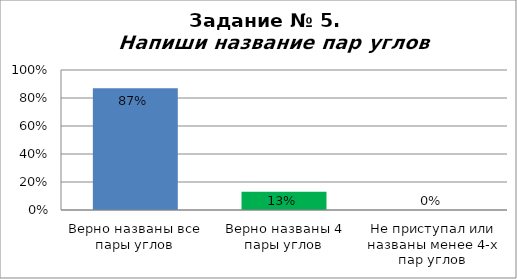
| Category | Напиши название пар углов |
|---|---|
| Верно названы все пары углов | 0.87 |
| Верно названы 4 пары углов | 0.13 |
| Не приступал или названы менее 4-х пар углов | 0 |